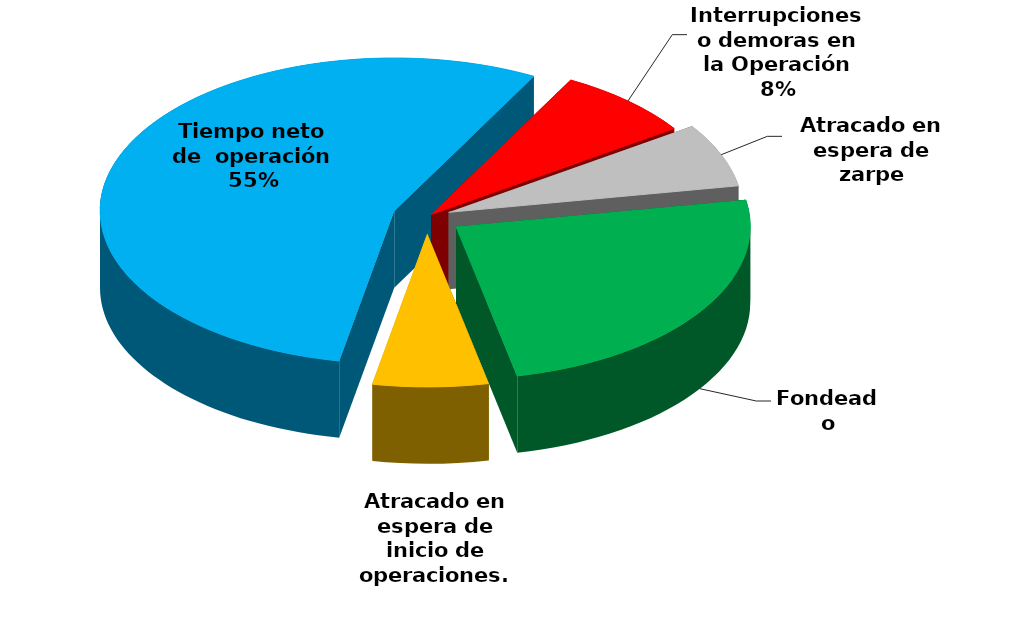
| Category | Series 0 |
|---|---|
| Fondeado | 7147.083 |
| Atracado en espera de inicio de operaciones. | 1852.056 |
| Tiempo neto de  operación | 16045.882 |
| Interrupciones o demoras en la Operación | 2228.9 |
| Atracado en espera de zarpe | 1970.163 |